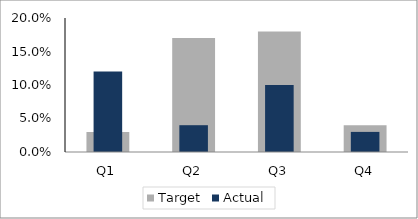
| Category | Target |
|---|---|
| Q1 | 0.03 |
| Q2 | 0.17 |
| Q3 | 0.18 |
| Q4 | 0.04 |